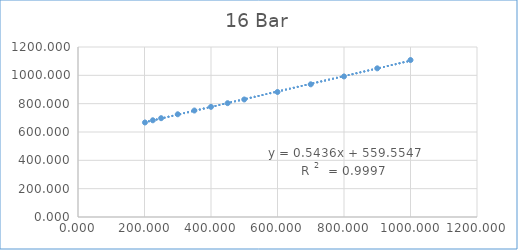
| Category | Series 0 |
|---|---|
| 201.4 | 667.176 |
| 225.0 | 682.704 |
| 250.0 | 697.539 |
| 300.0 | 725.131 |
| 350.0 | 751.553 |
| 400.0 | 777.568 |
| 450.0 | 803.512 |
| 500.0 | 829.575 |
| 600.0 | 882.441 |
| 700.0 | 936.574 |
| 800.0 | 992.188 |
| 900.0 | 1049.355 |
| 1000.0 | 1108.027 |